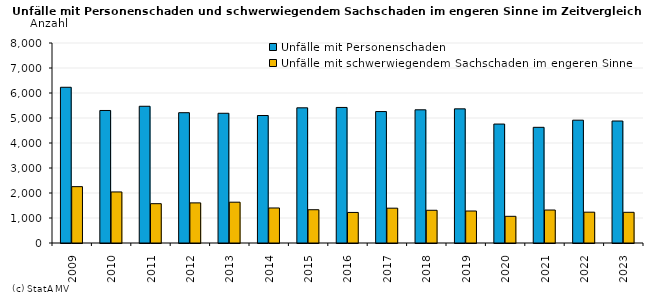
| Category | Unfälle mit Personenschaden | Unfälle mit schwerwiegendem Sachschaden im engeren Sinne |
|---|---|---|
| 2009.0 | 6229 | 2254 |
| 2010.0 | 5301 | 2042 |
| 2011.0 | 5469 | 1573 |
| 2012.0 | 5212 | 1605 |
| 2013.0 | 5189 | 1632 |
| 2014.0 | 5100 | 1401 |
| 2015.0 | 5407 | 1331 |
| 2016.0 | 5422 | 1222 |
| 2017.0 | 5258 | 1393 |
| 2018.0 | 5328 | 1309 |
| 2019.0 | 5366 | 1280 |
| 2020.0 | 4758 | 1067 |
| 2021.0 | 4627 | 1319 |
| 2022.0 | 4913 | 1233 |
| 2023.0 | 4880 | 1228 |